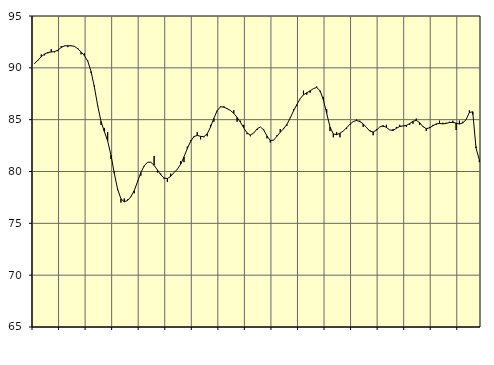
| Category | Piggar | Series 1 |
|---|---|---|
| nan | 90.4 | 90.44 |
| 87.0 | 90.7 | 90.74 |
| 87.0 | 91.3 | 91.07 |
| 87.0 | 91.2 | 91.34 |
| nan | 91.4 | 91.48 |
| 88.0 | 91.8 | 91.53 |
| 88.0 | 91.5 | 91.56 |
| 88.0 | 91.6 | 91.71 |
| nan | 92.1 | 91.96 |
| 89.0 | 92.1 | 92.12 |
| 89.0 | 92 | 92.13 |
| 89.0 | 92.1 | 92.13 |
| nan | 92.1 | 92.07 |
| 90.0 | 91.9 | 91.84 |
| 90.0 | 91.3 | 91.53 |
| 90.0 | 91.4 | 91.18 |
| nan | 90.7 | 90.64 |
| 91.0 | 89.5 | 89.65 |
| 91.0 | 88.3 | 88.14 |
| 91.0 | 86.3 | 86.34 |
| nan | 84.5 | 84.83 |
| 92.0 | 84.2 | 83.85 |
| 92.0 | 83.8 | 82.94 |
| 92.0 | 81.2 | 81.58 |
| nan | 80 | 79.82 |
| 93.0 | 78.2 | 78.29 |
| 93.0 | 77 | 77.37 |
| 93.0 | 77.4 | 77.07 |
| nan | 77.3 | 77.21 |
| 94.0 | 77.6 | 77.56 |
| 94.0 | 77.9 | 78.15 |
| 94.0 | 79.1 | 79.02 |
| nan | 79.6 | 79.9 |
| 95.0 | 80.5 | 80.54 |
| 95.0 | 80.9 | 80.89 |
| 95.0 | 80.9 | 80.9 |
| nan | 81.5 | 80.59 |
| 96.0 | 79.9 | 80.15 |
| 96.0 | 79.8 | 79.68 |
| 96.0 | 79.3 | 79.37 |
| nan | 79 | 79.32 |
| 97.0 | 79.8 | 79.54 |
| 97.0 | 79.9 | 79.89 |
| 97.0 | 80.2 | 80.22 |
| nan | 81 | 80.7 |
| 98.0 | 80.9 | 81.42 |
| 98.0 | 82.4 | 82.21 |
| 98.0 | 83 | 82.91 |
| nan | 83.3 | 83.37 |
| 99.0 | 83.8 | 83.48 |
| 99.0 | 83.1 | 83.39 |
| 99.0 | 83.3 | 83.36 |
| nan | 83.4 | 83.64 |
| 0.0 | 84.5 | 84.29 |
| 0.0 | 84.8 | 85.13 |
| 0.0 | 85.8 | 85.87 |
| nan | 86.3 | 86.24 |
| 1.0 | 86.3 | 86.21 |
| 1.0 | 86.1 | 86.06 |
| 1.0 | 85.9 | 85.89 |
| nan | 85.9 | 85.61 |
| 2.0 | 84.8 | 85.22 |
| 2.0 | 84.9 | 84.75 |
| 2.0 | 84.5 | 84.21 |
| nan | 83.6 | 83.72 |
| 3.0 | 83.4 | 83.52 |
| 3.0 | 83.7 | 83.71 |
| 3.0 | 84 | 84.1 |
| nan | 84.3 | 84.3 |
| 4.0 | 84.1 | 84.02 |
| 4.0 | 83.2 | 83.43 |
| 4.0 | 82.8 | 82.99 |
| nan | 83 | 83.02 |
| 5.0 | 83.5 | 83.4 |
| 5.0 | 84.1 | 83.79 |
| 5.0 | 84.2 | 84.12 |
| nan | 84.4 | 84.54 |
| 6.0 | 85.2 | 85.16 |
| 6.0 | 86 | 85.84 |
| 6.0 | 86.3 | 86.45 |
| nan | 87 | 87.02 |
| 7.0 | 87.8 | 87.4 |
| 7.0 | 87.4 | 87.59 |
| 7.0 | 87.6 | 87.78 |
| nan | 88 | 88 |
| 8.0 | 88.2 | 88.1 |
| 8.0 | 87.7 | 87.79 |
| 8.0 | 87.2 | 86.92 |
| nan | 86 | 85.61 |
| 9.0 | 83.9 | 84.29 |
| 9.0 | 83.3 | 83.63 |
| 9.0 | 83.8 | 83.55 |
| nan | 83.3 | 83.69 |
| 10.0 | 83.9 | 83.91 |
| 10.0 | 84.1 | 84.21 |
| 10.0 | 84.5 | 84.56 |
| nan | 84.8 | 84.82 |
| 11.0 | 85 | 84.92 |
| 11.0 | 84.9 | 84.82 |
| 11.0 | 84.3 | 84.59 |
| nan | 84.2 | 84.24 |
| 12.0 | 84 | 83.9 |
| 12.0 | 83.5 | 83.81 |
| 12.0 | 84.1 | 83.99 |
| nan | 84.3 | 84.3 |
| 13.0 | 84.3 | 84.42 |
| 13.0 | 84.5 | 84.25 |
| 13.0 | 84 | 84.01 |
| nan | 84.1 | 83.96 |
| 14.0 | 84.3 | 84.17 |
| 14.0 | 84.5 | 84.34 |
| 14.0 | 84.4 | 84.39 |
| nan | 84.3 | 84.45 |
| 15.0 | 84.5 | 84.62 |
| 15.0 | 84.6 | 84.85 |
| 15.0 | 85.1 | 84.93 |
| nan | 84.5 | 84.72 |
| 16.0 | 84.3 | 84.34 |
| 16.0 | 83.9 | 84.13 |
| 16.0 | 84.3 | 84.21 |
| nan | 84.5 | 84.41 |
| 17.0 | 84.5 | 84.59 |
| 17.0 | 84.9 | 84.64 |
| 17.0 | 84.7 | 84.59 |
| nan | 84.7 | 84.64 |
| 18.0 | 84.8 | 84.72 |
| 18.0 | 84.9 | 84.74 |
| 18.0 | 84 | 84.66 |
| nan | 84.9 | 84.58 |
| 19.0 | 84.8 | 84.68 |
| 19.0 | 85 | 85.01 |
| 19.0 | 85.9 | 85.69 |
| nan | 85.5 | 85.76 |
| 20.0 | 82.4 | 82.26 |
| 20.0 | 80.9 | 81.11 |